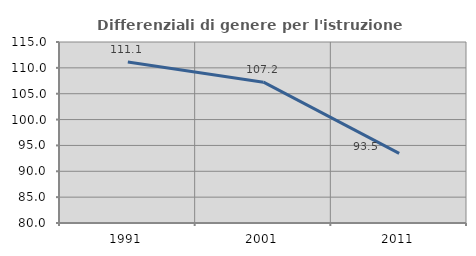
| Category | Differenziali di genere per l'istruzione superiore |
|---|---|
| 1991.0 | 111.119 |
| 2001.0 | 107.228 |
| 2011.0 | 93.451 |